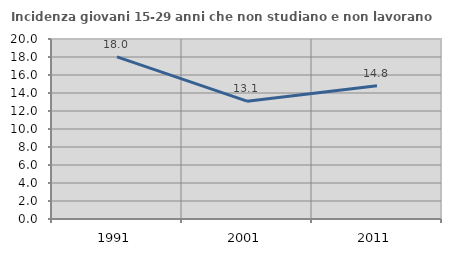
| Category | Incidenza giovani 15-29 anni che non studiano e non lavorano  |
|---|---|
| 1991.0 | 18.022 |
| 2001.0 | 13.095 |
| 2011.0 | 14.815 |